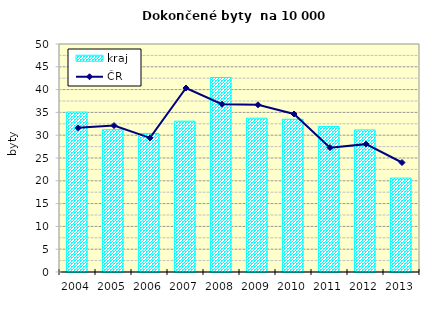
| Category | kraj |
|---|---|
| 2004.0 | 35.064 |
| 2005.0 | 31.208 |
| 2006.0 | 30.358 |
| 2007.0 | 33.07 |
| 2008.0 | 42.656 |
| 2009.0 | 33.735 |
| 2010.0 | 33.5 |
| 2011.0 | 31.891 |
| 2012.0 | 31.161 |
| 2013.0 | 20.599 |